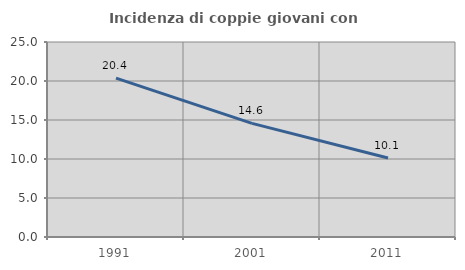
| Category | Incidenza di coppie giovani con figli |
|---|---|
| 1991.0 | 20.374 |
| 2001.0 | 14.571 |
| 2011.0 | 10.138 |